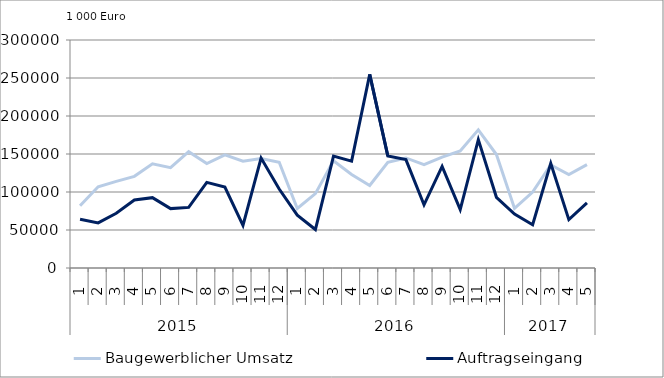
| Category | Baugewerblicher Umsatz | Auftragseingang |
|---|---|---|
| 0 | 81937.361 | 64244.383 |
| 1 | 106908.454 | 59377.677 |
| 2 | 113904.285 | 71953.971 |
| 3 | 120612.446 | 89496.024 |
| 4 | 137142.75 | 92563.213 |
| 5 | 132019.811 | 78131.737 |
| 6 | 153125.961 | 79765.729 |
| 7 | 137370.133 | 112637.987 |
| 8 | 148792.629 | 106572.56 |
| 9 | 140483.911 | 56073.767 |
| 10 | 144146.162 | 144643.688 |
| 11 | 139085.889 | 103931.175 |
| 12 | 78291.738 | 69470.357 |
| 13 | 97863.379 | 50640.033 |
| 14 | 141176.119 | 147206.65 |
| 15 | 123121.297 | 140579.009 |
| 16 | 108561.124 | 254739.334 |
| 17 | 139030.209 | 147481.644 |
| 18 | 144784.416 | 142609.658 |
| 19 | 135870.195 | 83192.156 |
| 20 | 145961.738 | 133594.351 |
| 21 | 153886.826 | 76793.838 |
| 22 | 181740.037 | 168867.568 |
| 23 | 149348.138 | 93011.853 |
| 24 | 78446.78 | 70908.903 |
| 25 | 99841.908 | 56868.408 |
| 26 | 135679.867 | 137790.423 |
| 27 | 123004.403 | 63637.761 |
| 28 | 136010.071 | 85644.63 |